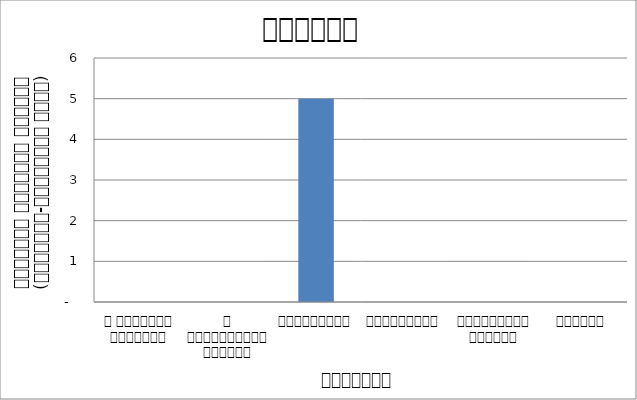
| Category | शिक्षा |
|---|---|
| द हिमालयन टाइम्स् | 0 |
| द काठमाण्डौं पोस्ट् | 0 |
| रिपब्लिका | 5 |
| कान्तिपुर | 0 |
| अन्नपूर्ण पोस्ट् | 0 |
| नागरिक | 0 |